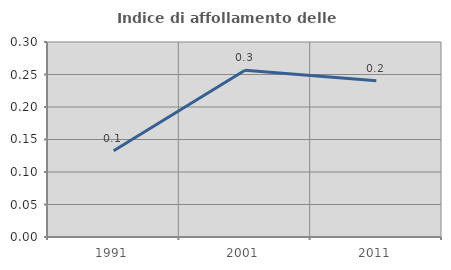
| Category | Indice di affollamento delle abitazioni  |
|---|---|
| 1991.0 | 0.133 |
| 2001.0 | 0.256 |
| 2011.0 | 0.24 |